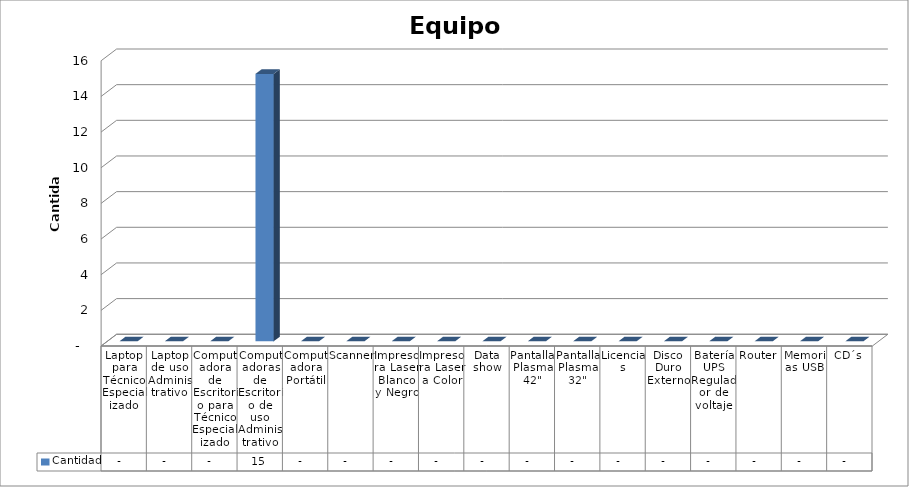
| Category | Cantidad |
|---|---|
| Laptop para Técnico Especializado | 0 |
| Laptop de uso Administrativo | 0 |
| Computadora de Escritorio para Técnico Especializado | 0 |
| Computadoras de Escritorio de uso Administrativo | 15 |
| Computadora Portátil | 0 |
| Scanner | 0 |
| Impresora Laser Blanco y Negro | 0 |
| Impresora Laser a Color | 0 |
| Data show | 0 |
| Pantalla Plasma 42" | 0 |
| Pantalla Plasma 32" | 0 |
| Licencias | 0 |
| Disco Duro Externo | 0 |
| Batería UPS Regulador de voltaje | 0 |
| Router | 0 |
| Memorias USB | 0 |
| CD´s | 0 |